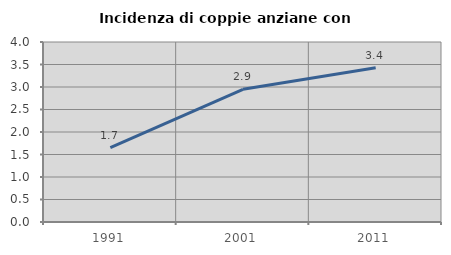
| Category | Incidenza di coppie anziane con figli |
|---|---|
| 1991.0 | 1.653 |
| 2001.0 | 2.95 |
| 2011.0 | 3.427 |